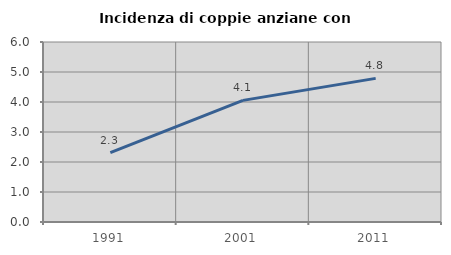
| Category | Incidenza di coppie anziane con figli |
|---|---|
| 1991.0 | 2.315 |
| 2001.0 | 4.054 |
| 2011.0 | 4.787 |